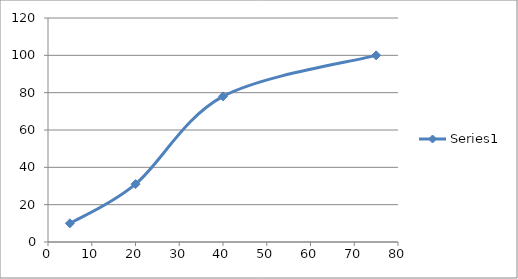
| Category | Series 0 |
|---|---|
| 5.0 | 10 |
| 20.0 | 31 |
| 40.0 | 78 |
| 75.0 | 100 |